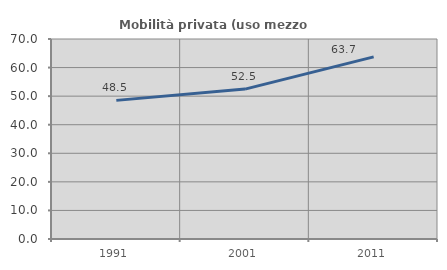
| Category | Mobilità privata (uso mezzo privato) |
|---|---|
| 1991.0 | 48.521 |
| 2001.0 | 52.459 |
| 2011.0 | 63.74 |